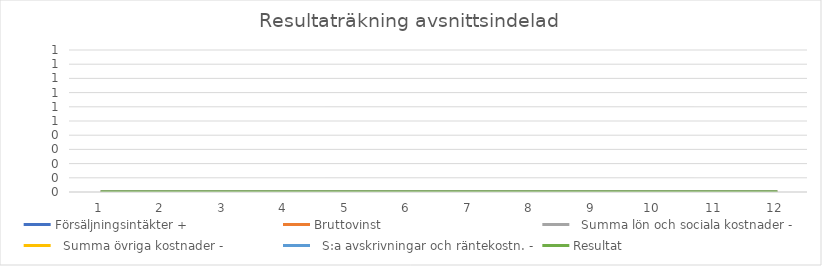
| Category | Försäljningsintäkter | Bruttovinst |   Summa lön och sociala kostnader |   Summa övriga kostnader |   S:a avskrivningar och räntekostn. | Resultat |
|---|---|---|---|---|---|---|
| 0 | 0 | 0 | 0 | 0 | 0 | 0 |
| 1 | 0 | 0 | 0 | 0 | 0 | 0 |
| 2 | 0 | 0 | 0 | 0 | 0 | 0 |
| 3 | 0 | 0 | 0 | 0 | 0 | 0 |
| 4 | 0 | 0 | 0 | 0 | 0 | 0 |
| 5 | 0 | 0 | 0 | 0 | 0 | 0 |
| 6 | 0 | 0 | 0 | 0 | 0 | 0 |
| 7 | 0 | 0 | 0 | 0 | 0 | 0 |
| 8 | 0 | 0 | 0 | 0 | 0 | 0 |
| 9 | 0 | 0 | 0 | 0 | 0 | 0 |
| 10 | 0 | 0 | 0 | 0 | 0 | 0 |
| 11 | 0 | 0 | 0 | 0 | 0 | 0 |